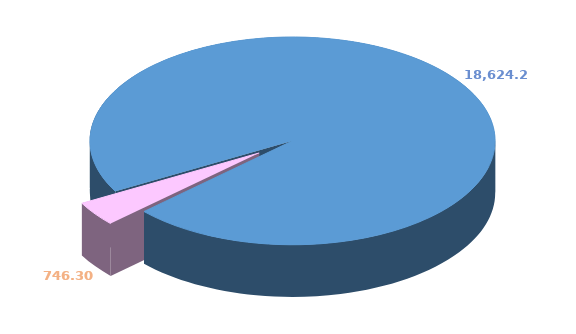
| Category | Series 0 |
|---|---|
| 0 | 18624.208 |
| 1 | 746.296 |